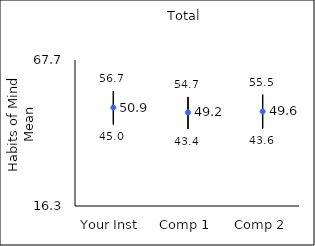
| Category | 25th percentile | 75th percentile | Mean |
|---|---|---|---|
| Your Inst | 45 | 56.7 | 50.94 |
| Comp 1 | 43.4 | 54.7 | 49.23 |
| Comp 2 | 43.6 | 55.5 | 49.57 |